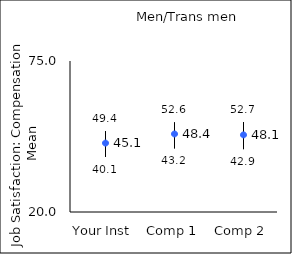
| Category | 25th percentile | 75th percentile | Mean |
|---|---|---|---|
| Your Inst | 40.1 | 49.4 | 45.1 |
| Comp 1 | 43.2 | 52.6 | 48.43 |
| Comp 2 | 42.9 | 52.7 | 48.09 |